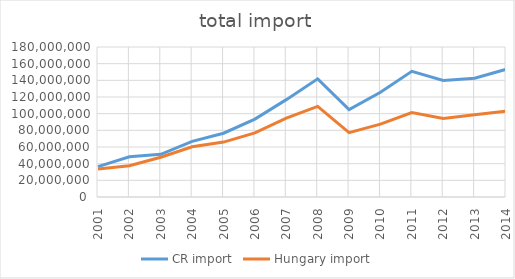
| Category | CR import | Hungary import |
|---|---|---|
| 2001.0 | 36476654 | 33681734 |
| 2002.0 | 48230794 | 37611572 |
| 2003.0 | 51239343 | 47674542 |
| 2004.0 | 66705682 | 60248602 |
| 2005.0 | 76527310 | 65919579 |
| 2006.0 | 93429474 | 76978511 |
| 2007.0 | 116822197 | 94659727 |
| 2008.0 | 141833836 | 108784724 |
| 2009.0 | 104849536 | 77272443 |
| 2010.0 | 125690658 | 87432095 |
| 2011.0 | 150813416 | 101369997 |
| 2012.0 | 139726824 | 94266239 |
| 2013.0 | 142525808 | 98661803 |
| 2014.0 | 153225461 | 103110997 |